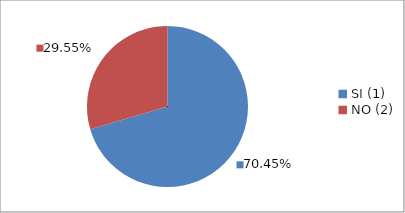
| Category | Series 0 |
|---|---|
| SI (1) | 0.704 |
| NO (2) | 0.296 |